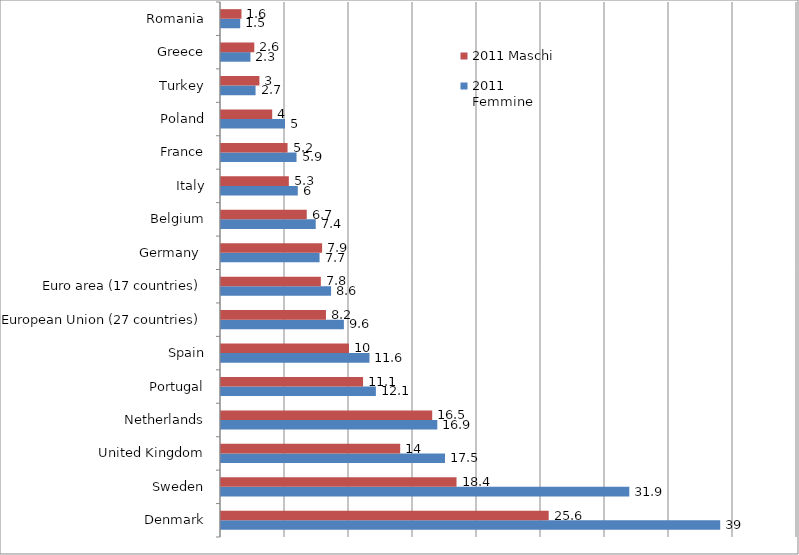
| Category | 2011 Femmine | 2011 Maschi |
|---|---|---|
| Denmark | 39 | 25.6 |
| Sweden | 31.9 | 18.4 |
| United Kingdom | 17.5 | 14 |
| Netherlands | 16.9 | 16.5 |
| Portugal | 12.1 | 11.1 |
| Spain | 11.6 | 10 |
| European Union (27 countries) | 9.6 | 8.2 |
| Euro area (17 countries) | 8.6 | 7.8 |
| Germany  | 7.7 | 7.9 |
| Belgium | 7.4 | 6.7 |
| Italy | 6 | 5.3 |
| France | 5.9 | 5.2 |
| Poland | 5 | 4 |
| Turkey | 2.7 | 3 |
| Greece | 2.3 | 2.6 |
| Romania | 1.5 | 1.6 |